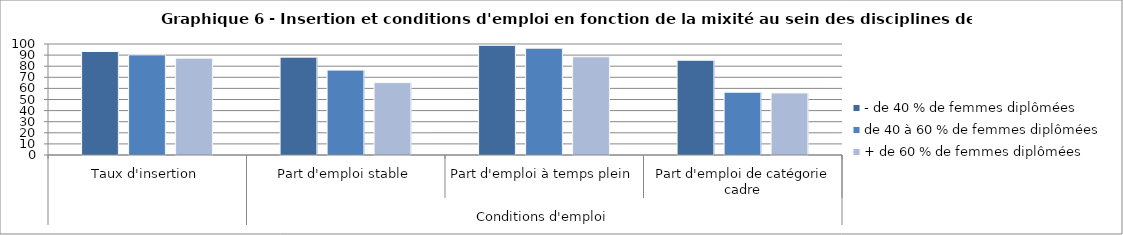
| Category | - de 40 % de femmes diplômées | de 40 à 60 % de femmes diplômées | + de 60 % de femmes diplômées |
|---|---|---|---|
| 0 | 93.23 | 90.24 | 87.25 |
| 1 | 88.16 | 76.49 | 65.2 |
| 2 | 98.78 | 96.23 | 88.46 |
| 3 | 85.37 | 56.55 | 55.87 |